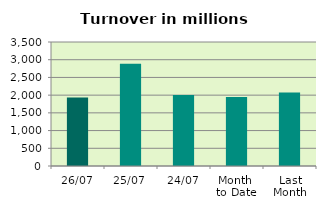
| Category | Series 0 |
|---|---|
| 26/07 | 1934.644 |
| 25/07 | 2888.121 |
| 24/07 | 2004.021 |
| Month 
to Date | 1948.108 |
| Last
Month | 2071.376 |